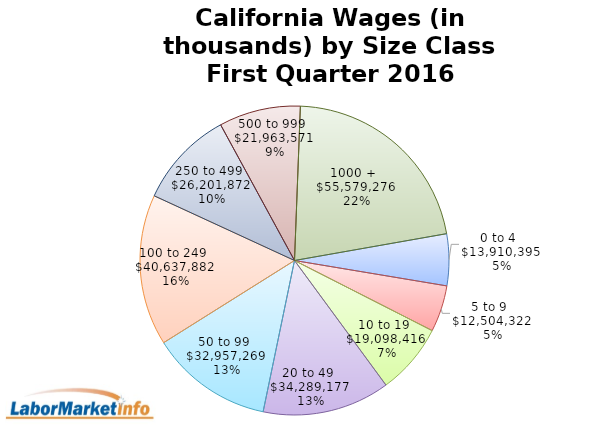
| Category | wages |
|---|---|
| 0 to 4   | 13910394.83 |
| 5 to 9   | 12504321.51 |
| 10 to 19   | 19098415.878 |
| 20 to 49   | 34289176.51 |
| 50 to 99   | 32957269.17 |
| 100 to 249   | 40637881.901 |
| 250 to 499   | 26201871.692 |
| 500 to 999   | 21963570.7 |
| 1000 +   | 55579275.699 |